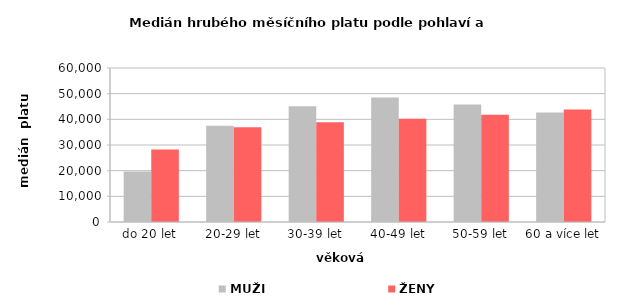
| Category | MUŽI | ŽENY |
|---|---|---|
| 0 | 19723.862 | 28276.491 |
| 1 | 37466.583 | 36896.614 |
| 2 | 45108.322 | 38890.048 |
| 3 | 48553.5 | 40252.787 |
| 4 | 45798.161 | 41829.711 |
| 5 | 42669.791 | 43833.72 |